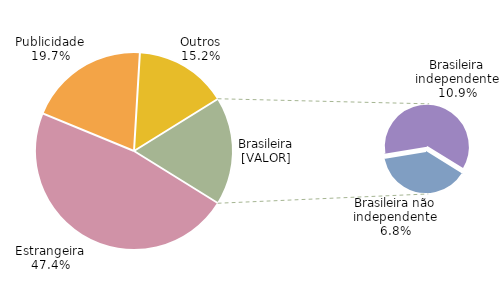
| Category | % |
|---|---|
| Estrangeira | 0.474 |
| Publicidade | 0.197 |
| Outros | 0.152 |
| Brasileira não independente | 0.068 |
| Brasileira independente | 0.109 |